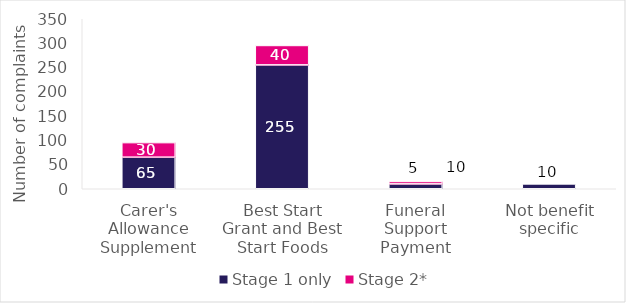
| Category | Stage 1 only | Stage 2* |
|---|---|---|
| Carer's Allowance Supplement | 65 | 30 |
| Best Start Grant and Best Start Foods | 255 | 40 |
| Funeral Support Payment | 10 | 5 |
| Not benefit specific | 10 | 0 |